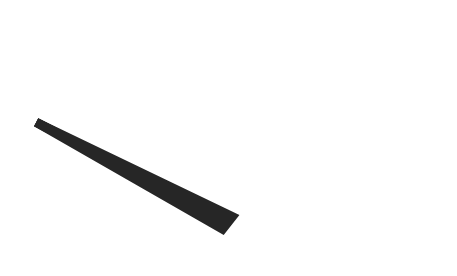
| Category | y |
|---|---|
| 7.953938826562442 | 27.058 |
| 51.08231510369175 | 1.682 |
| 48.91768489630825 | -1.682 |
| 7.953938826562442 | 27.058 |
| 50.0 | 0 |